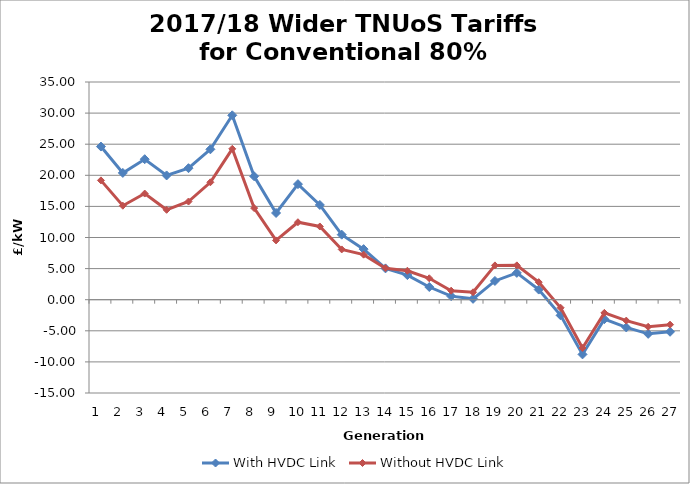
| Category | With HVDC Link | Without HVDC Link |
|---|---|---|
| 1.0 | 24.62 | 19.184 |
| 2.0 | 20.384 | 15.114 |
| 3.0 | 22.587 | 17.066 |
| 4.0 | 19.976 | 14.45 |
| 5.0 | 21.146 | 15.784 |
| 6.0 | 24.178 | 18.877 |
| 7.0 | 29.644 | 24.257 |
| 8.0 | 19.842 | 14.725 |
| 9.0 | 13.944 | 9.532 |
| 10.0 | 18.578 | 12.455 |
| 11.0 | 15.234 | 11.772 |
| 12.0 | 10.453 | 8.082 |
| 13.0 | 8.13 | 7.243 |
| 14.0 | 5.036 | 5.068 |
| 15.0 | 3.954 | 4.652 |
| 16.0 | 2.04 | 3.443 |
| 17.0 | 0.57 | 1.449 |
| 18.0 | 0.135 | 1.192 |
| 19.0 | 3.013 | 5.516 |
| 20.0 | 4.315 | 5.521 |
| 21.0 | 1.627 | 2.822 |
| 22.0 | -2.518 | -1.296 |
| 23.0 | -8.793 | -7.766 |
| 24.0 | -3.129 | -2.116 |
| 25.0 | -4.458 | -3.36 |
| 26.0 | -5.489 | -4.358 |
| 27.0 | -5.156 | -4.013 |